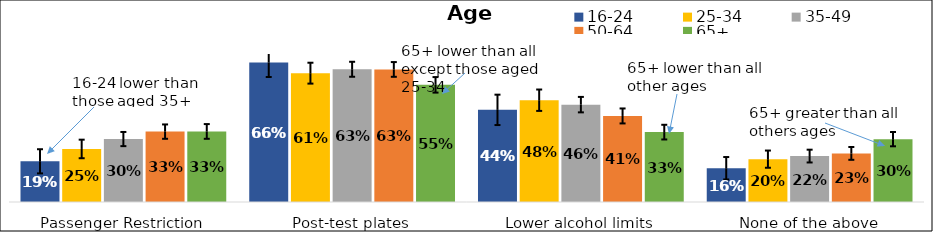
| Category | 16-24 | 25-34 | 35-49 | 50-64 | 65+ |
|---|---|---|---|---|---|
| Passenger Restriction | 0.192 | 0.251 | 0.298 | 0.333 | 0.334 |
| Post-test plates | 0.66 | 0.609 | 0.628 | 0.627 | 0.554 |
| Lower alcohol limits | 0.436 | 0.481 | 0.461 | 0.407 | 0.331 |
| None of the above | 0.16 | 0.203 | 0.217 | 0.23 | 0.297 |